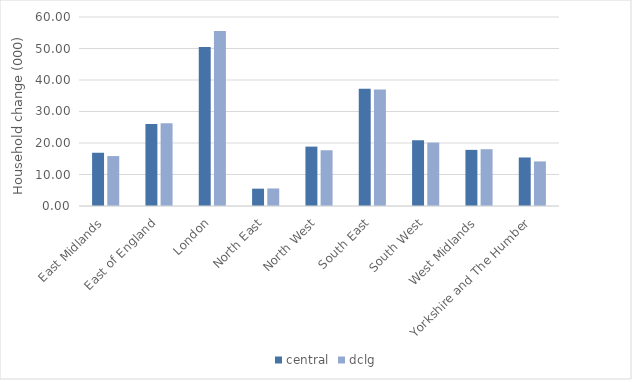
| Category | central | dclg |
|---|---|---|
| East Midlands | 16.905 | 15.852 |
| East of England | 26.056 | 26.238 |
| London | 50.469 | 55.592 |
| North East | 5.504 | 5.565 |
| North West | 18.852 | 17.698 |
| South East | 37.236 | 37.008 |
| South West | 20.858 | 20.142 |
| West Midlands | 17.818 | 18.028 |
| Yorkshire and The Humber | 15.406 | 14.157 |